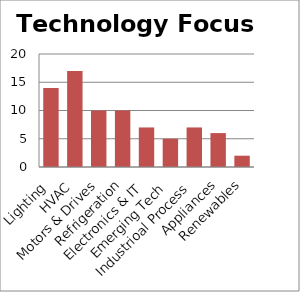
| Category | Technology Focus |
|---|---|
| Lighting | 14 |
| HVAC | 17 |
| Motors & Drives | 10 |
| Refrigeration | 10 |
| Electronics & IT | 7 |
| Emerging Tech | 5 |
| Industrioal Process | 7 |
| Appliances | 6 |
| Renewables | 2 |